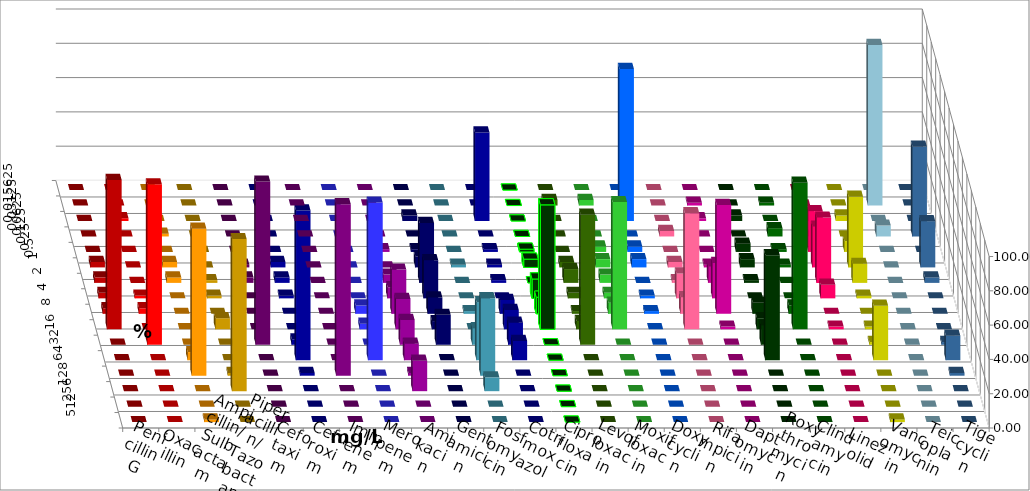
| Category | Penicillin G | Oxacillin | Ampicillin/ Sulbactam | Piperacillin/ Tazobactam | Cefotaxim | Cefuroxim | Imipenem | Meropenem | Amikacin | Gentamicin | Fosfomycin | Cotrimoxazol | Ciprofloxacin | Levofloxacin | Moxifloxacin | Doxycyclin | Rifampicin | Daptomycin | Roxythromycin | Clindamycin | Linezolid | Vancomycin | Teicoplanin | Tigecyclin |
|---|---|---|---|---|---|---|---|---|---|---|---|---|---|---|---|---|---|---|---|---|---|---|---|---|
| 0.015625 | 0 | 0 | 0 | 0 | 0 | 0 | 0 | 0 | 0 | 0 | 0 | 0 | 0 | 0 | 0 | 0 | 0 | 0 | 0 | 0 | 0 | 0 | 0 | 0 |
| 0.03125 | 0 | 0 | 0 | 0 | 0 | 0 | 0 | 0 | 0 | 0 | 0 | 0 | 0 | 3.226 | 3.226 | 0 | 0 | 1.587 | 0 | 1.613 | 0 | 0 | 0 | 93.651 |
| 0.0625 | 0 | 1.613 | 0 | 0 | 0 | 0 | 0 | 0 | 0 | 3.175 | 0 | 51.613 | 0 | 0 | 0 | 88.71 | 0 | 1.587 | 3.226 | 0 | 4.762 | 3.175 | 0 | 0 |
| 0.125 | 0 | 0 | 1.587 | 0 | 0 | 0 | 0 | 0 | 0 | 0 | 0 | 0 | 0 | 0 | 0 | 0 | 3.226 | 0 | 0 | 4.839 | 0 | 0 | 52.381 | 6.349 |
| 0.25 | 0 | 0 | 0 | 0 | 0 | 0 | 0 | 0 | 1.613 | 1.587 | 0 | 1.613 | 1.613 | 0 | 3.226 | 3.226 | 0 | 0 | 4.839 | 1.613 | 23.81 | 6.349 | 0 | 0 |
| 0.5 | 3.226 | 0 | 3.175 | 0 | 1.613 | 0 | 3.175 | 0 | 0 | 6.349 | 1.613 | 1.613 | 4.839 | 3.226 | 4.839 | 4.839 | 3.226 | 1.587 | 4.839 | 1.613 | 23.81 | 41.27 | 26.984 | 0 |
| 1.0 | 3.226 | 0 | 3.175 | 1.613 | 3.226 | 0 | 3.175 | 0 | 4.839 | 34.921 | 0 | 1.613 | 0 | 8.065 | 4.839 | 0 | 1.613 | 9.524 | 1.613 | 0 | 38.095 | 11.111 | 3.175 | 0 |
| 2.0 | 3.226 | 1.613 | 0 | 1.613 | 0 | 0 | 1.587 | 0 | 6.452 | 22.222 | 0 | 0 | 11.29 | 3.226 | 3.226 | 1.613 | 14.516 | 20.635 | 0 | 0 | 7.937 | 1.587 | 0 | 0 |
| 4.0 | 3.226 | 3.226 | 0 | 0 | 0 | 0 | 0 | 4.839 | 25.806 | 9.524 | 1.613 | 8.065 | 9.677 | 1.613 | 6.452 | 1.613 | 9.677 | 63.492 | 6.452 | 4.839 | 0 | 0 | 0 | 0 |
| 8.0 | 87.097 | 0 | 0 | 6.452 | 0 | 0 | 0 | 3.226 | 17.742 | 4.762 | 0 | 11.29 | 72.581 | 4.839 | 74.194 | 0 | 67.742 | 1.587 | 6.452 | 85.484 | 1.587 | 1.587 | 0 | 0 |
| 16.0 | 0 | 93.548 | 0 | 0 | 95.161 | 0 | 3.175 | 0 | 14.516 | 17.46 | 9.677 | 12.903 | 0 | 75.806 | 0 | 0 | 0 | 0 | 11.29 | 0 | 0 | 1.587 | 1.587 | 0 |
| 32.0 | 0 | 0 | 4.762 | 0 | 0 | 0 | 87.302 | 91.935 | 9.677 | 0 | 33.871 | 11.29 | 0 | 0 | 0 | 0 | 0 | 0 | 61.29 | 0 | 0 | 31.746 | 14.286 | 0 |
| 64.0 | 0 | 0 | 85.714 | 1.613 | 0 | 100 | 1.587 | 0 | 1.613 | 0 | 45.161 | 0 | 0 | 0 | 0 | 0 | 0 | 0 | 0 | 0 | 0 | 0 | 1.587 | 0 |
| 128.0 | 0 | 0 | 0 | 88.71 | 0 | 0 | 0 | 0 | 17.742 | 0 | 8.065 | 0 | 0 | 0 | 0 | 0 | 0 | 0 | 0 | 0 | 0 | 0 | 0 | 0 |
| 256.0 | 0 | 0 | 0 | 0 | 0 | 0 | 0 | 0 | 0 | 0 | 0 | 0 | 0 | 0 | 0 | 0 | 0 | 0 | 0 | 0 | 0 | 0 | 0 | 0 |
| 512.0 | 0 | 0 | 1.587 | 0 | 0 | 0 | 0 | 0 | 0 | 0 | 0 | 0 | 0 | 0 | 0 | 0 | 0 | 0 | 0 | 0 | 0 | 1.587 | 0 | 0 |